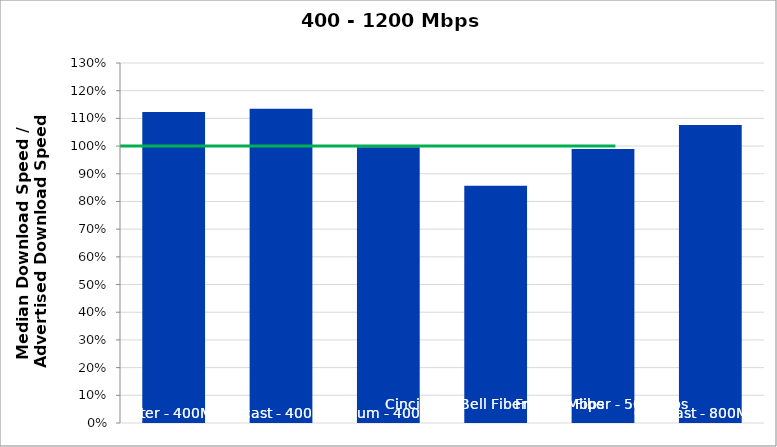
| Category | Series 0 |
|---|---|
| Charter - 400Mbps | 1.123 |
| Comcast - 400Mbps | 1.135 |
| Optimum - 400Mbps | 0.995 |
| Cincinnati Bell Fiber - 500Mbps | 0.856 |
| Frontier Fiber - 500Mbps | 0.989 |
| Comcast - 800Mbps | 1.076 |